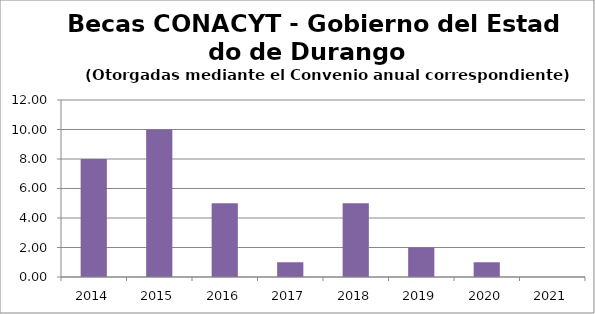
| Category | Becas CONACYT - Gobierno del Estado de Durango (Otorgadas mediante el Convenio correspondiente) |
|---|---|
| 2014.0 | 8 |
| 2015.0 | 10 |
| 2016.0 | 5 |
| 2017.0 | 1 |
| 2018.0 | 5 |
| 2019.0 | 2 |
| 2020.0 | 1 |
| 2021.0 | 0 |